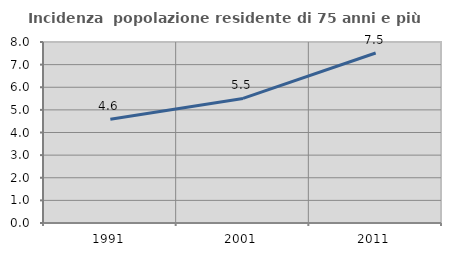
| Category | Incidenza  popolazione residente di 75 anni e più |
|---|---|
| 1991.0 | 4.589 |
| 2001.0 | 5.506 |
| 2011.0 | 7.513 |